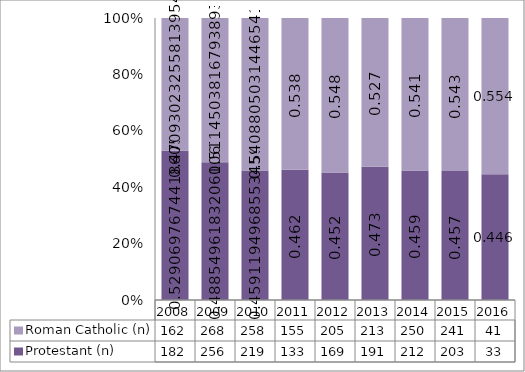
| Category | Protestant (n) | Roman Catholic (n) |
|---|---|---|
| 2008.0 | 182 | 162 |
| 2009.0 | 256 | 268 |
| 2010.0 | 219 | 258 |
| 2011.0 | 133 | 155 |
| 2012.0 | 169 | 205 |
| 2013.0 | 191 | 213 |
| 2014.0 | 212 | 250 |
| 2015.0 | 203 | 241 |
| 2016.0 | 33 | 41 |